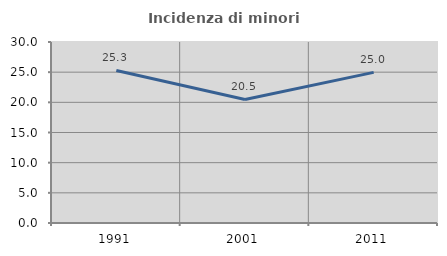
| Category | Incidenza di minori stranieri |
|---|---|
| 1991.0 | 25.287 |
| 2001.0 | 20.475 |
| 2011.0 | 24.961 |